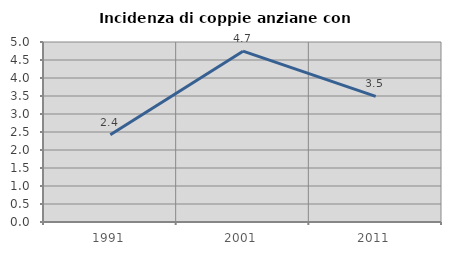
| Category | Incidenza di coppie anziane con figli |
|---|---|
| 1991.0 | 2.424 |
| 2001.0 | 4.746 |
| 2011.0 | 3.488 |